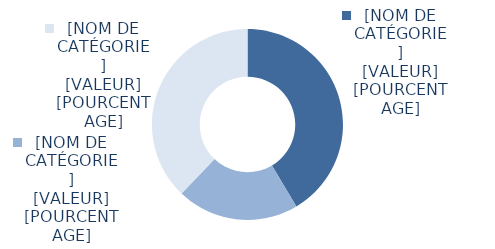
| Category | Series 0 |
|---|---|
| Genève | 7569 |
| Autres cantons | 3775 |
| De l'étranger | 6917 |